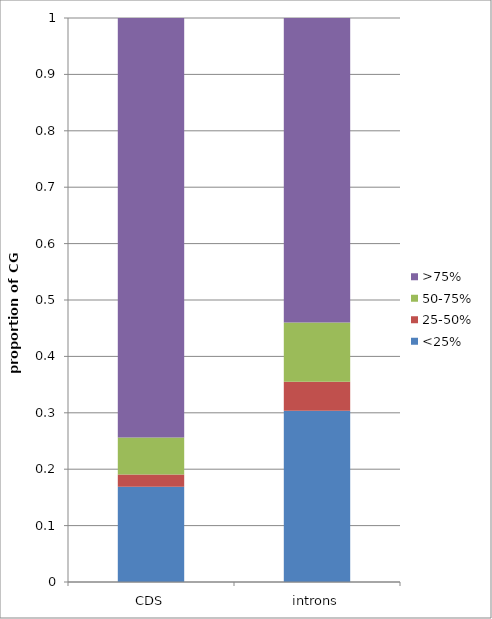
| Category | <25% | 25-50% | 50-75% | >75% |
|---|---|---|---|---|
| CDS | 0.169 | 0.021 | 0.066 | 0.744 |
| introns | 0.303 | 0.052 | 0.105 | 0.54 |